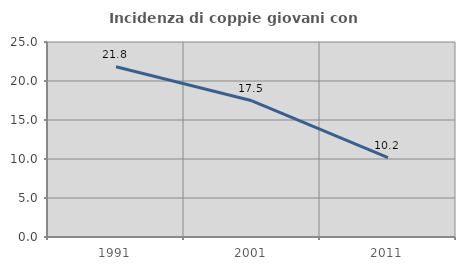
| Category | Incidenza di coppie giovani con figli |
|---|---|
| 1991.0 | 21.818 |
| 2001.0 | 17.465 |
| 2011.0 | 10.165 |